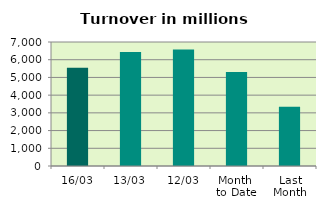
| Category | Series 0 |
|---|---|
| 16/03 | 5543.864 |
| 13/03 | 6428.701 |
| 12/03 | 6571.368 |
| Month 
to Date | 5303.791 |
| Last
Month | 3347.876 |